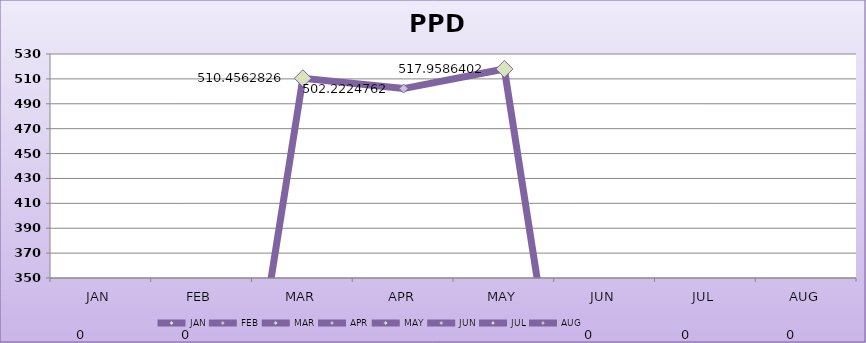
| Category | PPD |
|---|---|
| 0 | 0 |
| 1 | 0 |
| 2 | 510.456 |
| 3 | 502.222 |
| 4 | 517.959 |
| 5 | 0 |
| 6 | 0 |
| 7 | 0 |